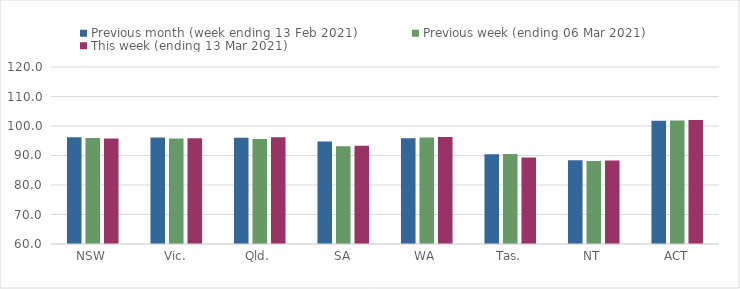
| Category | Previous month (week ending 13 Feb 2021) | Previous week (ending 06 Mar 2021) | This week (ending 13 Mar 2021) |
|---|---|---|---|
| NSW | 96.18 | 95.91 | 95.75 |
| Vic. | 96.09 | 95.73 | 95.85 |
| Qld. | 96.03 | 95.56 | 96.16 |
| SA | 94.74 | 93.1 | 93.32 |
| WA | 95.87 | 96.09 | 96.26 |
| Tas. | 90.42 | 90.47 | 89.31 |
| NT | 88.39 | 88.16 | 88.33 |
| ACT | 101.76 | 101.88 | 102.07 |